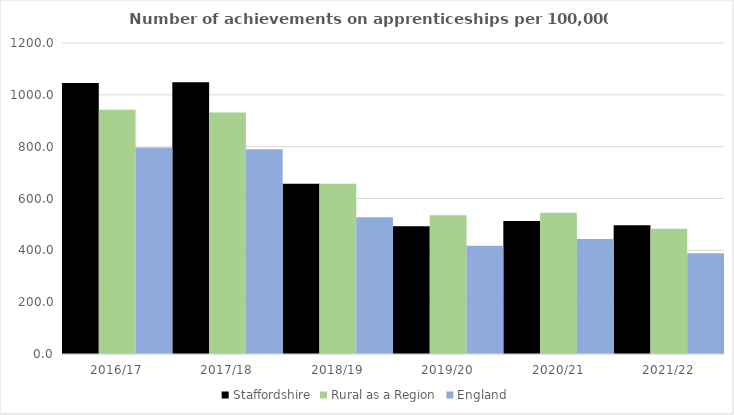
| Category | Staffordshire | Rural as a Region | England |
|---|---|---|---|
| 2016/17 | 1045.412 | 942.594 | 797 |
| 2017/18 | 1048.89 | 931.709 | 790 |
| 2018/19 | 657.207 | 656.44 | 528 |
| 2019/20 | 492.586 | 535.552 | 418 |
| 2020/21 | 513.149 | 545.333 | 444 |
| 2021/22 | 496.366 | 482.936 | 389 |